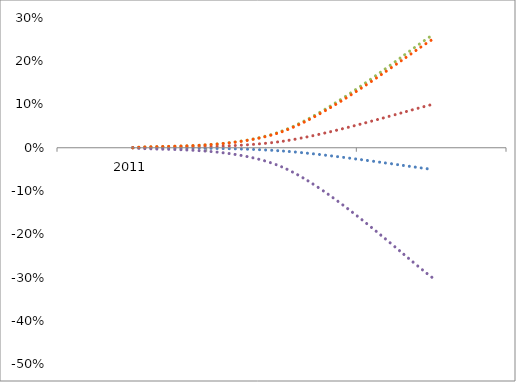
| Category | Series 0 | Series 1 | Series 2 | Series 3 | Series 4 |
|---|---|---|---|---|---|
| 0 | 0 | 0 | 0 | 0 | 0 |
| 1 | -0.008 | 0.015 | 0.039 | -0.045 | 0.038 |
| 2 | -0.05 | 0.1 | 0.26 | -0.3 | 0.25 |